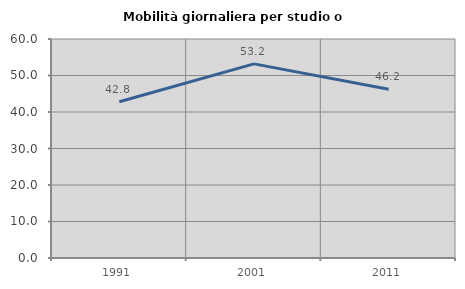
| Category | Mobilità giornaliera per studio o lavoro |
|---|---|
| 1991.0 | 42.821 |
| 2001.0 | 53.179 |
| 2011.0 | 46.219 |